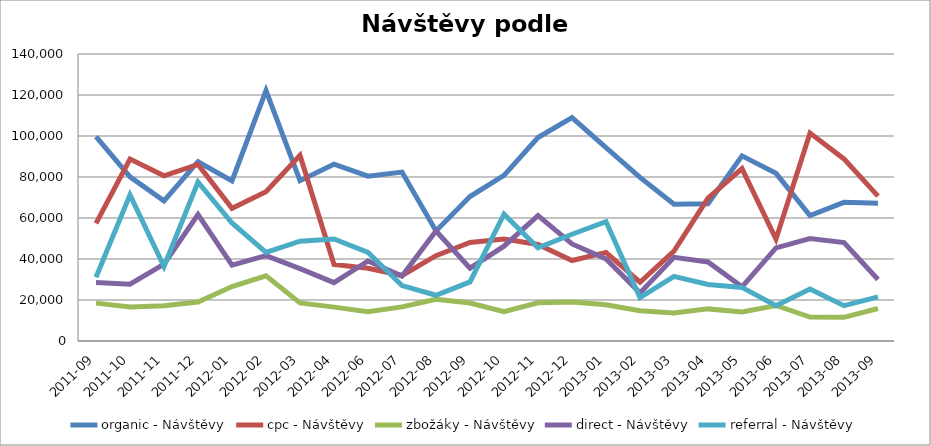
| Category | organic - Návštěvy | cpc - Návštěvy | zbožáky - Návštěvy | direct - Návštěvy | referral - Návštěvy |
|---|---|---|---|---|---|
| 2011-09 | 99656.743 | 57415.461 | 18469.279 | 28584.256 | 31069.247 |
| 2011-10 | 80064.502 | 88771.556 | 16641.504 | 27690.383 | 71311.918 |
| 2011-11 | 68371.3 | 80601.824 | 17249.73 | 37485.623 | 36338.716 |
| 2011-12 | 87449.295 | 86099.583 | 19040.951 | 61693.059 | 77470.338 |
| 2012-01 | 78103.012 | 64738.582 | 26585.64 | 37010.21 | 57569.468 |
| 2012-02 | 122182.865 | 72783.469 | 31773.054 | 41677.554 | 43252.298 |
| 2012-03 | 78205.523 | 90537.585 | 18561.841 | 35267.233 | 48671.334 |
| 2012-04 | 86218.631 | 37370.494 | 16529.389 | 28459.558 | 49798.051 |
| 2012-06 | 80377.725 | 35491.964 | 14224.008 | 39017.672 | 43164.894 |
| 2012-07 | 82380.738 | 31954.702 | 16627.622 | 31653.76 | 27051.121 |
| 2012-08 | 53687.037 | 41634.542 | 20336.664 | 53661.645 | 22305.048 |
| 2012-09 | 70470.322 | 48071.729 | 18529.956 | 35520.023 | 28821.02 |
| 2012-10 | 80811.046 | 49719.818 | 14250.219 | 46239.19 | 61869.717 |
| 2012-11 | 99236.507 | 47064.433 | 18646.267 | 61203.802 | 45459.014 |
| 2012-12 | 108978.765 | 39248.546 | 19063.319 | 47354.202 | 52086.904 |
| 2013-01 | 94297.805 | 43237.762 | 17663.253 | 40050.252 | 58261.373 |
| 2013-02 | 79799.251 | 28669.914 | 14725.06 | 23479.952 | 21162.935 |
| 2013-03 | 66704.643 | 43867.694 | 13693.766 | 40803.136 | 31541.839 |
| 2013-04 | 66959.511 | 69657.034 | 15665.444 | 38577.252 | 27561.265 |
| 2013-05 | 90304.187 | 84121.455 | 14179.967 | 26419.543 | 26147.826 |
| 2013-06 | 81793.447 | 49720.775 | 17325.872 | 45415.358 | 17205.48 |
| 2013-07 | 61163.218 | 101439.133 | 11647.188 | 49965.344 | 25381.164 |
| 2013-08 | 67628.705 | 88825.709 | 11537.592 | 48030.982 | 17225.168 |
| 2013-09 | 67254.796 | 70700.271 | 15851.897 | 29977.822 | 21490.638 |